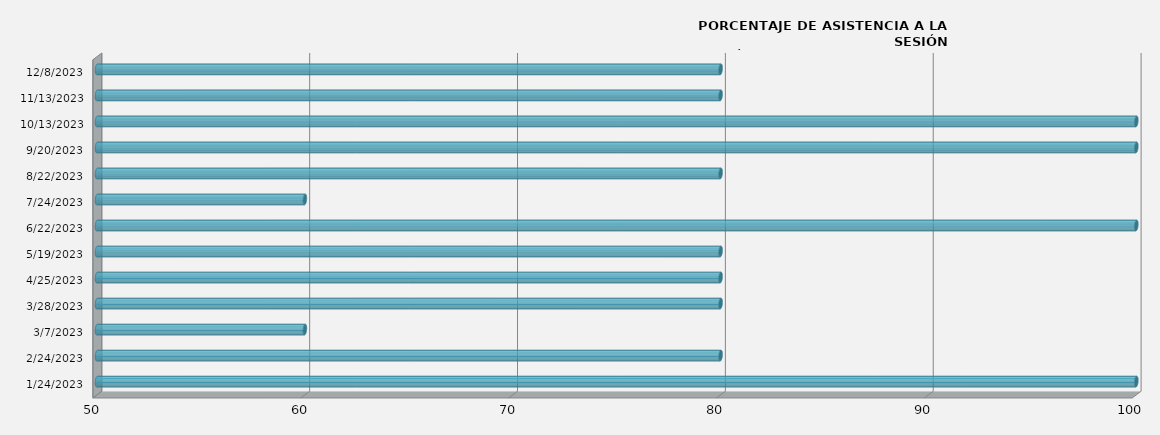
| Category | Series 0 |
|---|---|
| 1/24/23 | 100 |
| 2/24/23 | 80 |
| 3/7/23 | 60 |
| 3/28/23 | 80 |
| 4/25/23 | 80 |
| 5/19/23 | 80 |
| 6/22/23 | 100 |
| 7/24/23 | 60 |
| 8/22/23 | 80 |
| 9/20/23 | 100 |
| 10/13/23 | 100 |
| 11/13/23 | 80 |
| 12/8/23 | 80 |